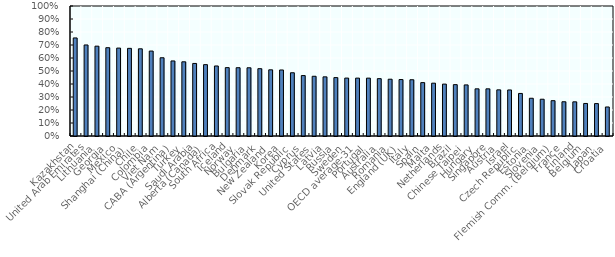
| Category | Series 3 |
|---|---|
| Kazakhstan | 0.754 |
| United Arab Emirates | 0.7 |
| Lithuania | 0.691 |
| Georgia | 0.679 |
| Mexico | 0.676 |
| Shanghai (China) | 0.674 |
| Chile | 0.671 |
| Colombia | 0.653 |
| Viet Nam | 0.602 |
| CABA (Argentina) | 0.577 |
| Turkey | 0.571 |
| Saudi Arabia | 0.558 |
| Alberta (Canada) | 0.549 |
| South Africa | 0.539 |
| Iceland | 0.526 |
| Norway | 0.525 |
| Bulgaria | 0.525 |
| Denmark | 0.518 |
| New Zealand | 0.509 |
| Korea | 0.508 |
| Slovak Republic | 0.487 |
| Cyprus | 0.465 |
| United States | 0.459 |
| Latvia | 0.455 |
| Russia | 0.449 |
| Sweden | 0.446 |
| OECD average-31 | 0.445 |
| Portugal | 0.445 |
| Australia | 0.441 |
| Romania | 0.437 |
| England (UK) | 0.434 |
| Italy | 0.433 |
| Spain | 0.411 |
| Malta | 0.406 |
| Netherlands | 0.399 |
| Brazil | 0.395 |
| Chinese Taipei | 0.393 |
| Hungary | 0.363 |
| Singapore | 0.363 |
| Austria | 0.355 |
| Israel | 0.354 |
| Czech Republic | 0.327 |
| Estonia | 0.29 |
| Slovenia | 0.283 |
| Flemish Comm. (Belgium) | 0.272 |
| France | 0.263 |
| Finland | 0.263 |
| Belgium | 0.25 |
| Japan | 0.249 |
| Croatia | 0.223 |